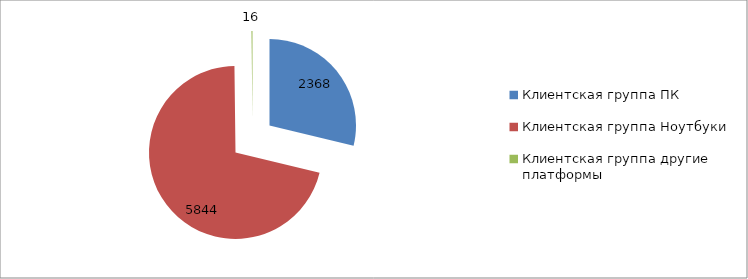
| Category | Series 0 |
|---|---|
| Клиентская группа ПК | 2368 |
| Клиентская группа Ноутбуки | 5844 |
| Клиентская группа другие платформы | 16 |